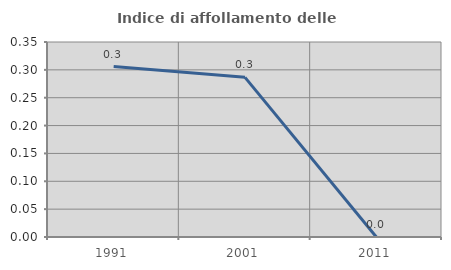
| Category | Indice di affollamento delle abitazioni  |
|---|---|
| 1991.0 | 0.306 |
| 2001.0 | 0.287 |
| 2011.0 | 0 |